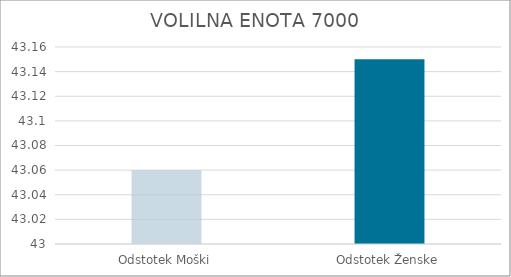
| Category | Series 0 |
|---|---|
| Odstotek Moški | 43.06 |
| Odstotek Ženske | 43.15 |